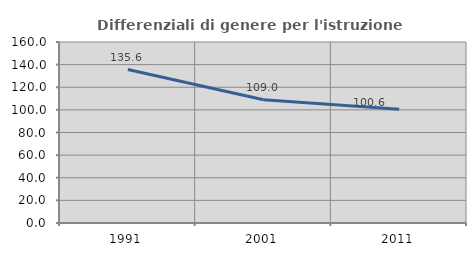
| Category | Differenziali di genere per l'istruzione superiore |
|---|---|
| 1991.0 | 135.624 |
| 2001.0 | 108.971 |
| 2011.0 | 100.555 |